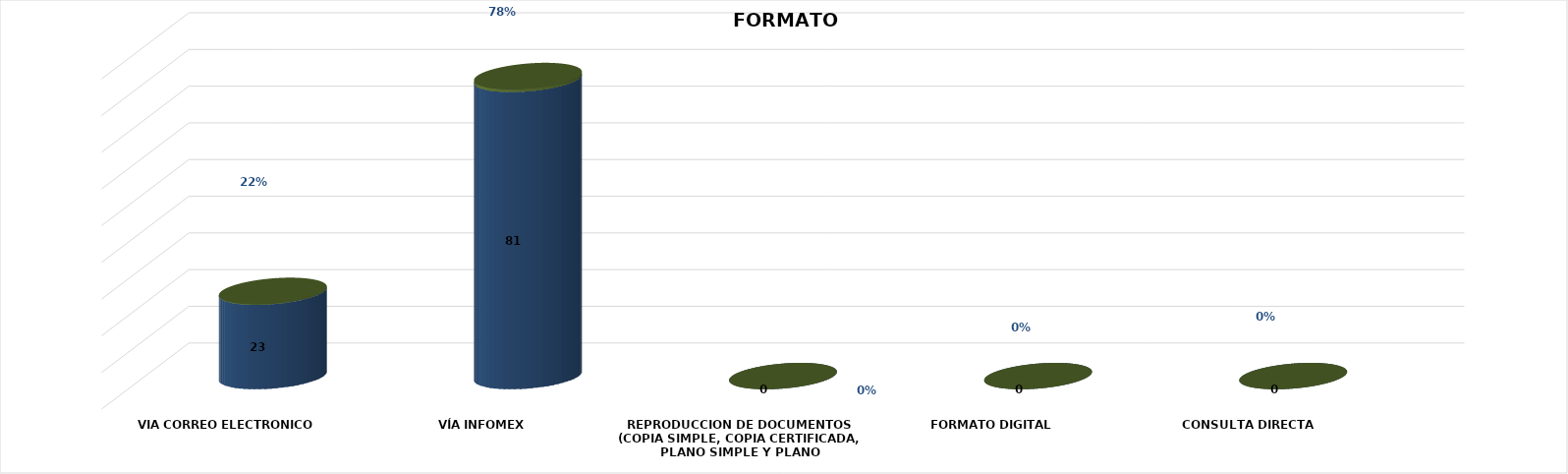
| Category | Series 0 | Series 1 | Series 2 | Series 3 | Series 4 |
|---|---|---|---|---|---|
| VIA CORREO ELECTRONICO |  |  |  | 23 | 0.221 |
| VÍA INFOMEX |  |  |  | 81 | 0.779 |
| REPRODUCCION DE DOCUMENTOS (COPIA SIMPLE, COPIA CERTIFICADA, PLANO SIMPLE Y PLANO CERTIFICADO) |  |  |  | 0 | 0 |
| FORMATO DIGITAL |  |  |  | 0 | 0 |
| CONSULTA DIRECTA |  |  |  | 0 | 0 |